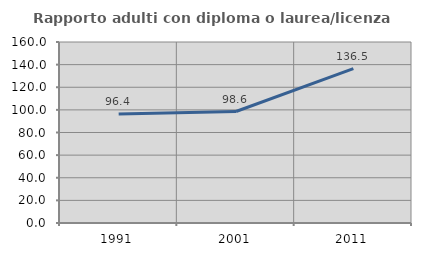
| Category | Rapporto adulti con diploma o laurea/licenza media  |
|---|---|
| 1991.0 | 96.386 |
| 2001.0 | 98.551 |
| 2011.0 | 136.486 |